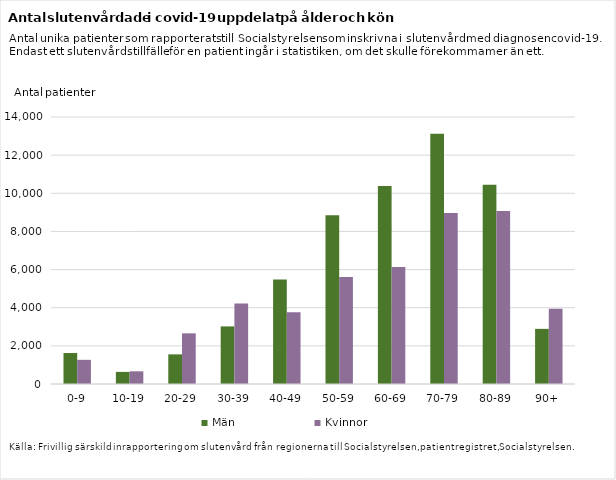
| Category | Män | Kvinnor |
|---|---|---|
| 0-9 | 1624 | 1267 |
| 10-19 | 634 | 665 |
| 20-29 | 1554 | 2656 |
| 30-39 | 3020 | 4224 |
| 40-49 | 5479 | 3764 |
| 50-59 | 8850 | 5604 |
| 60-69 | 10386 | 6139 |
| 70-79 | 13125 | 8968 |
| 80-89 | 10442 | 9075 |
| 90+ | 2891 | 3941 |